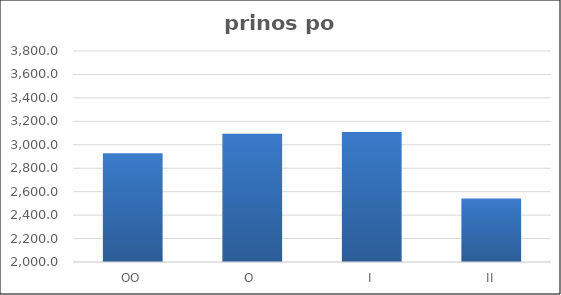
| Category | Series 0 |
|---|---|
| OO | 2927 |
| O  | 3095 |
| I | 3110 |
| II | 2542 |